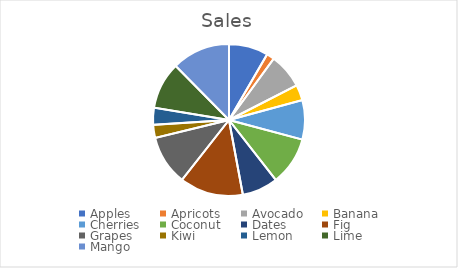
| Category | Sales |
|---|---|
| Apples | 571 |
| Apricots | 113 |
| Avocado | 507 |
| Banana | 227 |
| Cherries | 571 |
| Coconut | 703 |
| Dates | 520 |
| Fig | 923 |
| Grapes | 724 |
| Kiwi | 189 |
| Lemon | 247 |
| Lime | 682 |
| Mango | 846 |